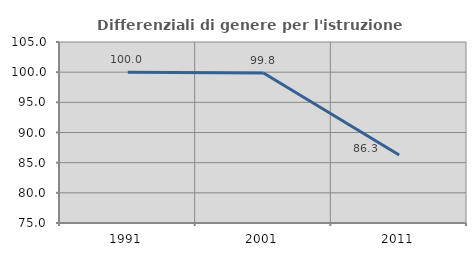
| Category | Differenziali di genere per l'istruzione superiore |
|---|---|
| 1991.0 | 100 |
| 2001.0 | 99.85 |
| 2011.0 | 86.264 |